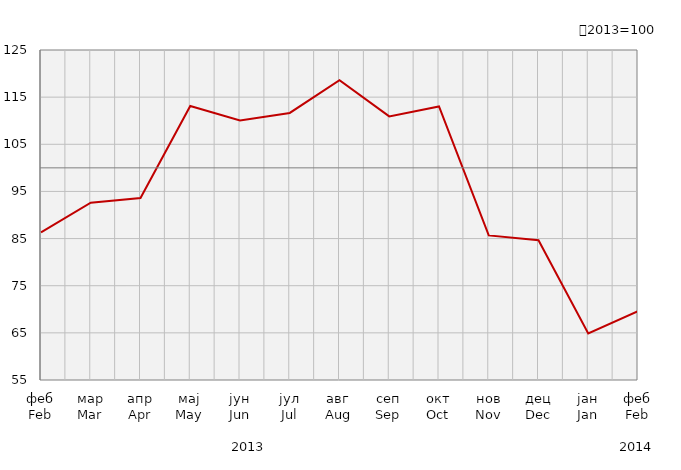
| Category | Индекси ноћења туриста
Tourist night indices |
|---|---|
| феб
Feb | 86.301 |
| мар
Mar | 92.617 |
| апр
Apr | 93.597 |
| мај
May | 113.125 |
| јун
Jun | 110.07 |
| јул
Jul | 111.646 |
| авг
Aug | 118.578 |
| сеп
Sep | 110.922 |
| окт
Oct | 113.026 |
| нов
Nov | 85.665 |
| дец
Dec | 84.657 |
| јан
Jan | 64.882 |
| феб
Feb | 69.586 |